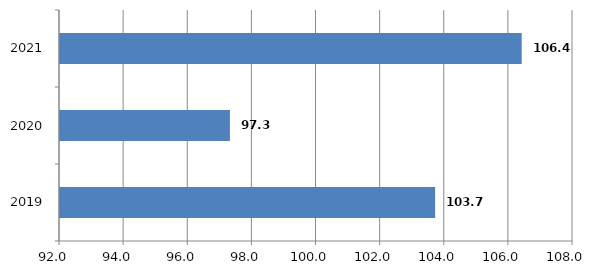
| Category | Series 0 |
|---|---|
| 2019.0 | 103.7 |
| 2020.0 | 97.3 |
| 2021.0 | 106.4 |